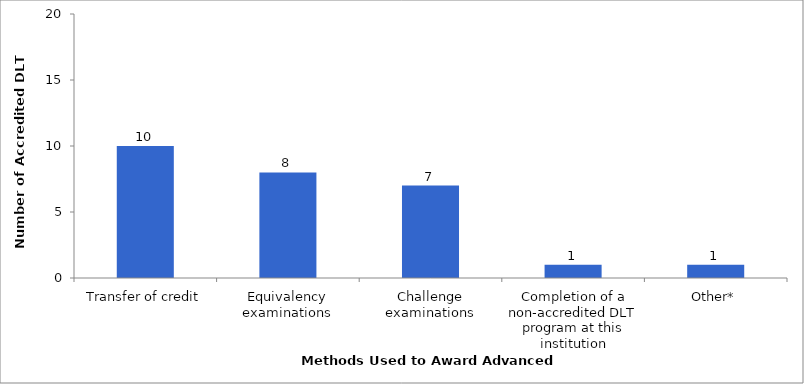
| Category | 2015-16 |
|---|---|
| Transfer of credit | 10 |
| Equivalency examinations | 8 |
| Challenge examinations | 7 |
| Completion of a non-accredited DLT program at this institution | 1 |
| Other* | 1 |